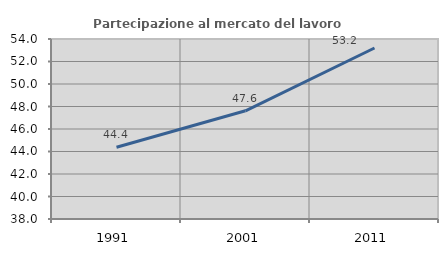
| Category | Partecipazione al mercato del lavoro  femminile |
|---|---|
| 1991.0 | 44.379 |
| 2001.0 | 47.619 |
| 2011.0 | 53.202 |